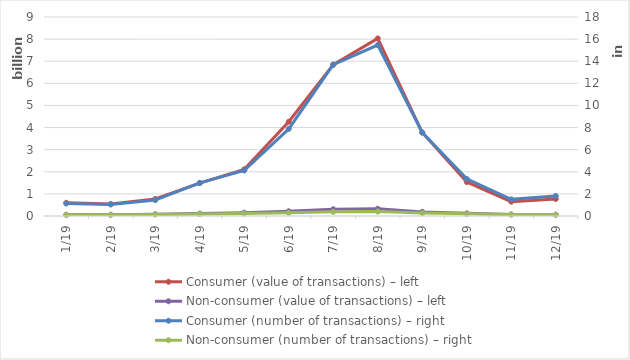
| Category | Consumer (value of transactions) – left | Non-consumer (value of transactions) – left |
|---|---|---|
| 2019-01-01 | 597453233 | 54649501 |
| 2019-02-01 | 544813653 | 57286423 |
| 2019-03-01 | 772543855 | 80652545 |
| 2019-04-01 | 1488036890 | 111202427 |
| 2019-05-01 | 2110447712 | 151509105 |
| 2019-06-01 | 4262918156 | 214072603 |
| 2019-07-01 | 6844145935 | 304996668 |
| 2019-08-01 | 8030233674 | 329496408 |
| 2019-09-01 | 3775430974 | 186529499 |
| 2019-10-01 | 1538309778 | 120944466 |
| 2019-11-01 | 644567725 | 66348906 |
| 2019-12-01 | 769942084 | 58144061 |